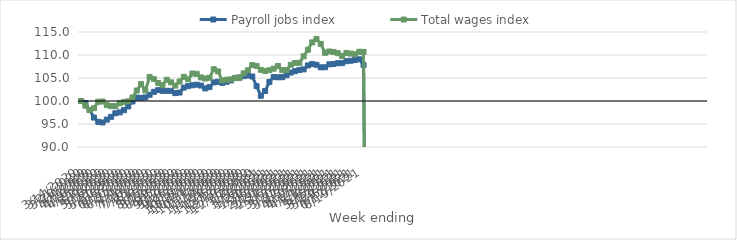
| Category | Payroll jobs index | Total wages index |
|---|---|---|
| 14/03/2020 | 100 | 100 |
| 21/03/2020 | 99.571 | 98.987 |
| 28/03/2020 | 98.034 | 98.044 |
| 04/04/2020 | 96.396 | 98.439 |
| 11/04/2020 | 95.467 | 99.841 |
| 18/04/2020 | 95.338 | 99.892 |
| 25/04/2020 | 95.954 | 99.112 |
| 02/05/2020 | 96.554 | 98.884 |
| 09/05/2020 | 97.334 | 98.877 |
| 16/05/2020 | 97.525 | 99.514 |
| 23/05/2020 | 98.004 | 99.781 |
| 30/05/2020 | 98.823 | 99.938 |
| 06/06/2020 | 99.895 | 100.76 |
| 13/06/2020 | 100.74 | 102.278 |
| 20/06/2020 | 100.688 | 103.67 |
| 27/06/2020 | 100.781 | 102.31 |
| 04/07/2020 | 101.351 | 105.225 |
| 11/07/2020 | 101.994 | 104.761 |
| 18/07/2020 | 102.374 | 103.918 |
| 25/07/2020 | 102.208 | 103.438 |
| 01/08/2020 | 102.217 | 104.618 |
| 08/08/2020 | 102.202 | 104.058 |
| 15/08/2020 | 101.717 | 103.343 |
| 22/08/2020 | 101.84 | 104.247 |
| 29/08/2020 | 102.917 | 105.25 |
| 05/09/2020 | 103.228 | 104.702 |
| 12/09/2020 | 103.421 | 105.977 |
| 19/09/2020 | 103.55 | 105.906 |
| 26/09/2020 | 103.359 | 105.126 |
| 03/10/2020 | 102.735 | 104.884 |
| 10/10/2020 | 103.024 | 105.056 |
| 17/10/2020 | 104.05 | 106.914 |
| 24/10/2020 | 104.177 | 106.443 |
| 31/10/2020 | 103.936 | 104.461 |
| 07/11/2020 | 104.182 | 104.63 |
| 14/11/2020 | 104.468 | 104.714 |
| 21/11/2020 | 104.979 | 105.035 |
| 28/11/2020 | 105.136 | 104.975 |
| 05/12/2020 | 105.407 | 106.009 |
| 12/12/2020 | 105.567 | 106.676 |
| 19/12/2020 | 105.326 | 107.814 |
| 26/12/2020 | 103.235 | 107.626 |
| 02/01/2021 | 101.13 | 106.772 |
| 09/01/2021 | 102.178 | 106.528 |
| 16/01/2021 | 104.144 | 106.698 |
| 23/01/2021 | 105.205 | 107.027 |
| 30/01/2021 | 105.154 | 107.624 |
| 06/02/2021 | 105.175 | 106.71 |
| 13/02/2021 | 105.601 | 106.708 |
| 20/02/2021 | 106.18 | 107.882 |
| 27/02/2021 | 106.487 | 108.257 |
| 06/03/2021 | 106.75 | 108.303 |
| 13/03/2021 | 106.872 | 109.713 |
| 20/03/2021 | 107.726 | 111.143 |
| 27/03/2021 | 108.024 | 112.747 |
| 03/04/2021 | 107.873 | 113.49 |
| 10/04/2021 | 107.323 | 112.414 |
| 17/04/2021 | 107.336 | 110.477 |
| 24/04/2021 | 107.972 | 110.766 |
| 01/05/2021 | 108.042 | 110.658 |
| 08/05/2021 | 108.228 | 110.397 |
| 15/05/2021 | 108.224 | 109.795 |
| 22/05/2021 | 108.653 | 110.457 |
| 29/05/2021 | 108.746 | 110.305 |
| 05/06/2021 | 108.911 | 110.156 |
| 12/06/2021 | 109.072 | 110.702 |
| 19/06/2021 | 107.819 | 110.668 |